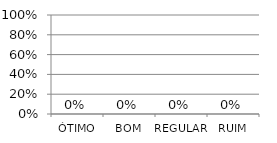
| Category | Series 0 |
|---|---|
| ÓTIMO | 0 |
| BOM | 0 |
| REGULAR | 0 |
| RUIM | 0 |